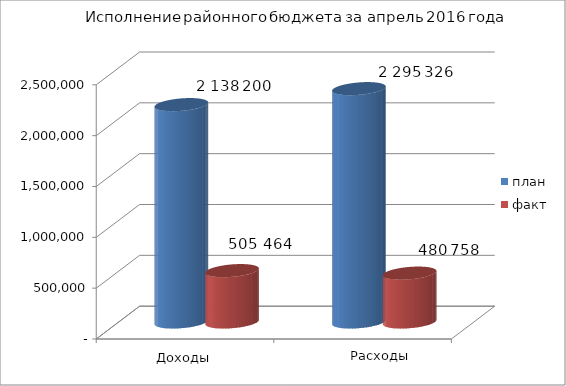
| Category | план | факт |
|---|---|---|
| 0 | 2138200 | 505464 |
| 1 | 2295326 | 480758 |